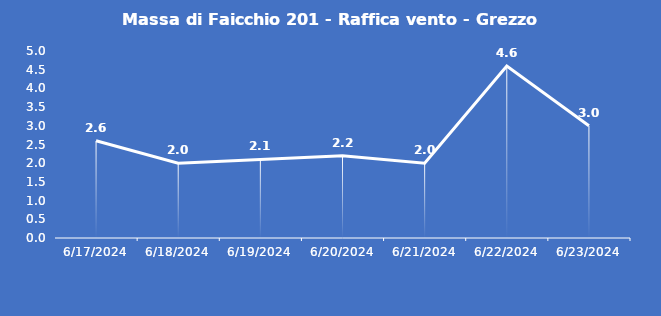
| Category | Massa di Faicchio 201 - Raffica vento - Grezzo (m/s) |
|---|---|
| 6/17/24 | 2.6 |
| 6/18/24 | 2 |
| 6/19/24 | 2.1 |
| 6/20/24 | 2.2 |
| 6/21/24 | 2 |
| 6/22/24 | 4.6 |
| 6/23/24 | 3 |